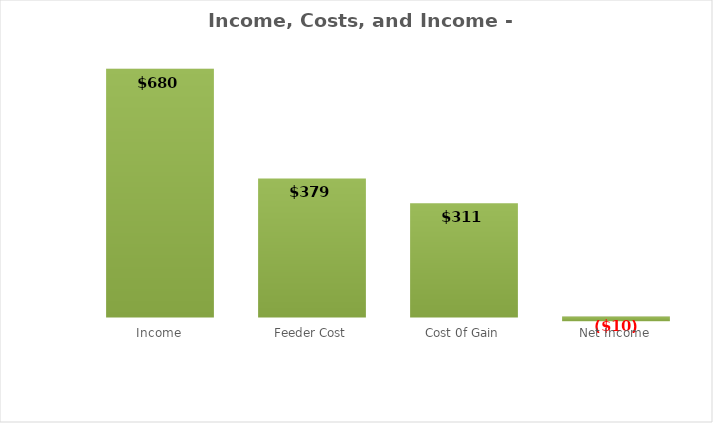
| Category |  $/Head |
|---|---|
| Income | 680 |
| Feeder Cost | 379.153 |
| Cost 0f Gain | 311.063 |
| Net Income | -10.215 |